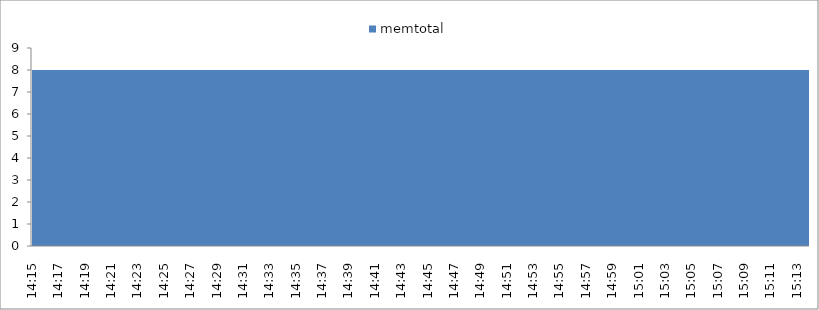
| Category | memtotal |
|---|---|
| 14:15 | 8003.4 |
| 14:16 | 8003.4 |
| 14:17 | 8003.4 |
| 14:18 | 8003.4 |
| 14:19 | 8003.4 |
| 14:20 | 8003.4 |
| 14:21 | 8003.4 |
| 14:22 | 8003.4 |
| 14:23 | 8003.4 |
| 14:24 | 8003.4 |
| 14:25 | 8003.4 |
| 14:26 | 8003.4 |
| 14:27 | 8003.4 |
| 14:28 | 8003.4 |
| 14:29 | 8003.4 |
| 14:30 | 8003.4 |
| 14:31 | 8003.4 |
| 14:32 | 8003.4 |
| 14:33 | 8003.4 |
| 14:34 | 8003.4 |
| 14:35 | 8003.4 |
| 14:36 | 8003.4 |
| 14:37 | 8003.4 |
| 14:38 | 8003.4 |
| 14:39 | 8003.4 |
| 14:40 | 8003.4 |
| 14:41 | 8003.4 |
| 14:42 | 8003.4 |
| 14:43 | 8003.4 |
| 14:44 | 8003.4 |
| 14:45 | 8003.4 |
| 14:46 | 8003.4 |
| 14:47 | 8003.4 |
| 14:48 | 8003.4 |
| 14:49 | 8003.4 |
| 14:50 | 8003.4 |
| 14:51 | 8003.4 |
| 14:52 | 8003.4 |
| 14:53 | 8003.4 |
| 14:54 | 8003.4 |
| 14:55 | 8003.4 |
| 14:56 | 8003.4 |
| 14:57 | 8003.4 |
| 14:58 | 8003.4 |
| 14:59 | 8003.4 |
| 15:00 | 8003.4 |
| 15:01 | 8003.4 |
| 15:02 | 8003.4 |
| 15:03 | 8003.4 |
| 15:04 | 8003.4 |
| 15:05 | 8003.4 |
| 15:06 | 8003.4 |
| 15:07 | 8003.4 |
| 15:08 | 8003.4 |
| 15:09 | 8003.4 |
| 15:10 | 8003.4 |
| 15:11 | 8003.4 |
| 15:12 | 8003.4 |
| 15:13 | 8003.4 |
| 15:14 | 8003.4 |